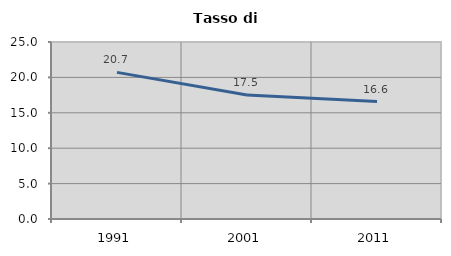
| Category | Tasso di disoccupazione   |
|---|---|
| 1991.0 | 20.711 |
| 2001.0 | 17.517 |
| 2011.0 | 16.583 |